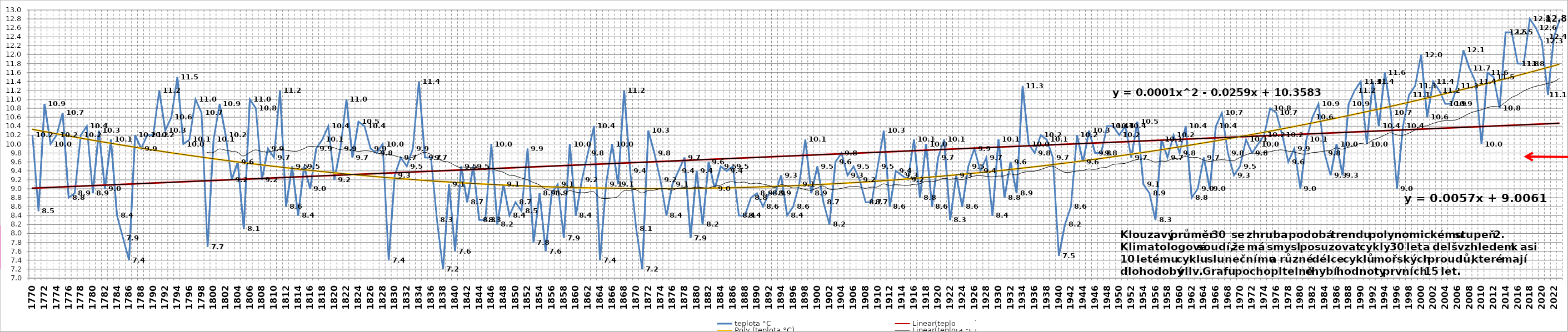
| Category | teplota °C |
|---|---|
| 1770 | 10.2 |
| 1771 | 8.5 |
| 1772 | 10.9 |
| 1773 | 10 |
| 1774 | 10.2 |
| 1775 | 10.7 |
| 1776 | 8.8 |
| 1777 | 8.9 |
| 1778 | 10.2 |
| 1779 | 10.4 |
| 1780 | 8.9 |
| 1781 | 10.3 |
| 1782 | 9 |
| 1783 | 10.1 |
| 1784 | 8.4 |
| 1785 | 7.9 |
| 1786 | 7.4 |
| 1787 | 10.2 |
| 1788 | 9.9 |
| 1789 | 10.2 |
| 1790 | 10.2 |
| 1791 | 11.2 |
| 1792 | 10.3 |
| 1793 | 10.6 |
| 1794 | 11.5 |
| 1795 | 10 |
| 1796 | 10.1 |
| 1797 | 11 |
| 1798 | 10.7 |
| 1799 | 7.7 |
| 1800 | 10.1 |
| 1801 | 10.9 |
| 1802 | 10.2 |
| 1803 | 9.2 |
| 1804 | 9.6 |
| 1805 | 8.1 |
| 1806 | 11 |
| 1807 | 10.8 |
| 1808 | 9.2 |
| 1809 | 9.9 |
| 1810 | 9.7 |
| 1811 | 11.2 |
| 1812 | 8.6 |
| 1813 | 9.5 |
| 1814 | 8.4 |
| 1815 | 9.5 |
| 1816 | 9 |
| 1817 | 9.9 |
| 1818 | 10.1 |
| 1819 | 10.4 |
| 1820 | 9.2 |
| 1821 | 9.9 |
| 1822 | 11 |
| 1823 | 9.7 |
| 1824 | 10.5 |
| 1825 | 10.4 |
| 1826 | 9.9 |
| 1827 | 9.8 |
| 1828 | 10 |
| 1829 | 7.4 |
| 1830 | 9.3 |
| 1831 | 9.7 |
| 1832 | 9.5 |
| 1833 | 9.9 |
| 1834 | 11.4 |
| 1835 | 9.7 |
| 1836 | 9.7 |
| 1837 | 8.3 |
| 1838 | 7.2 |
| 1839 | 9.1 |
| 1840 | 7.6 |
| 1841 | 9.5 |
| 1842 | 8.7 |
| 1843 | 9.5 |
| 1844 | 8.3 |
| 1845 | 8.3 |
| 1846 | 10 |
| 1847 | 8.2 |
| 1848 | 9.1 |
| 1849 | 8.4 |
| 1850 | 8.7 |
| 1851 | 8.5 |
| 1852 | 9.9 |
| 1853 | 7.8 |
| 1854 | 8.9 |
| 1855 | 7.6 |
| 1856 | 8.9 |
| 1857 | 9.1 |
| 1858 | 7.9 |
| 1859 | 10 |
| 1860 | 8.4 |
| 1861 | 9.2 |
| 1862 | 9.8 |
| 1863 | 10.4 |
| 1864 | 7.4 |
| 1865 | 9.1 |
| 1866 | 10 |
| 1867 | 9.1 |
| 1868 | 11.2 |
| 1869 | 9.4 |
| 1870 | 8.1 |
| 1871 | 7.2 |
| 1872 | 10.3 |
| 1873 | 9.8 |
| 1874 | 9.2 |
| 1875 | 8.4 |
| 1876 | 9.1 |
| 1877 | 9.4 |
| 1878 | 9.7 |
| 1879 | 7.9 |
| 1880 | 9.4 |
| 1881 | 8.2 |
| 1882 | 9.6 |
| 1883 | 9 |
| 1884 | 9.5 |
| 1885 | 9.4 |
| 1886 | 9.5 |
| 1887 | 8.4 |
| 1888 | 8.4 |
| 1889 | 8.8 |
| 1890 | 8.9 |
| 1891 | 8.6 |
| 1892 | 8.9 |
| 1893 | 8.9 |
| 1894 | 9.3 |
| 1895 | 8.4 |
| 1896 | 8.6 |
| 1897 | 9.1 |
| 1898 | 10.1 |
| 1899 | 8.9 |
| 1900 | 9.5 |
| 1901 | 8.7 |
| 1902 | 8.2 |
| 1903 | 9.6 |
| 1904 | 9.8 |
| 1905 | 9.3 |
| 1906 | 9.5 |
| 1907 | 9.2 |
| 1908 | 8.7 |
| 1909 | 8.7 |
| 1910 | 9.5 |
| 1911 | 10.3 |
| 1912 | 8.6 |
| 1913 | 9.4 |
| 1914 | 9.3 |
| 1915 | 9.2 |
| 1916 | 10.1 |
| 1917 | 8.8 |
| 1918 | 10 |
| 1919 | 8.6 |
| 1920 | 9.7 |
| 1921 | 10.1 |
| 1922 | 8.3 |
| 1923 | 9.3 |
| 1924 | 8.6 |
| 1925 | 9.5 |
| 1926 | 9.9 |
| 1927 | 9.4 |
| 1928 | 9.7 |
| 1929 | 8.4 |
| 1930 | 10.1 |
| 1931 | 8.8 |
| 1932 | 9.6 |
| 1933 | 8.9 |
| 1934 | 11.3 |
| 1935 | 10 |
| 1936 | 9.8 |
| 1937 | 10.2 |
| 1938 | 10.1 |
| 1939 | 9.7 |
| 1940 | 7.5 |
| 1941 | 8.2 |
| 1942 | 8.6 |
| 1943 | 10.2 |
| 1944 | 9.6 |
| 1945 | 10.3 |
| 1946 | 9.8 |
| 1947 | 9.8 |
| 1948 | 10.4 |
| 1949 | 10.4 |
| 1950 | 10.2 |
| 1951 | 10.4 |
| 1952 | 9.7 |
| 1953 | 10.5 |
| 1954 | 9.1 |
| 1955 | 8.9 |
| 1956 | 8.3 |
| 1957 | 10.1 |
| 1958 | 9.7 |
| 1959 | 10.2 |
| 1960 | 9.8 |
| 1961 | 10.4 |
| 1962 | 8.8 |
| 1963 | 9 |
| 1964 | 9.7 |
| 1965 | 9 |
| 1966 | 10.4 |
| 1967 | 10.7 |
| 1968 | 9.8 |
| 1969 | 9.3 |
| 1970 | 9.5 |
| 1971 | 10.1 |
| 1972 | 9.8 |
| 1973 | 10 |
| 1974 | 10.2 |
| 1975 | 10.8 |
| 1976 | 10.7 |
| 1977 | 10.2 |
| 1978 | 9.6 |
| 1979 | 9.9 |
| 1980 | 9 |
| 1981 | 10.1 |
| 1982 | 10.6 |
| 1983 | 10.9 |
| 1984 | 9.8 |
| 1985 | 9.3 |
| 1986 | 10 |
| 1987 | 9.3 |
| 1988 | 10.9 |
| 1989 | 11.2 |
| 1990 | 11.4 |
| 1991 | 10 |
| 1992 | 11.4 |
| 1993 | 10.4 |
| 1994 | 11.6 |
| 1995 | 10.7 |
| 1996 | 9 |
| 1997 | 10.4 |
| 1998 | 11.1 |
| 1999 | 11.3 |
| 2000 | 12 |
| 2001 | 10.6 |
| 2002 | 11.4 |
| 2003 | 11.2 |
| 2004 | 10.9 |
| 2005 | 10.9 |
| 2006 | 11.3 |
| 2007 | 12.1 |
| 2008 | 11.7 |
| 2009 | 11.4 |
| 2010 | 10 |
| 2011 | 11.6 |
| 2012 | 11.5 |
| 2013 | 10.8 |
| 2014 | 12.5 |
| 2015 | 12.5 |
| 2016 | 11.8 |
| 2017 | 11.8 |
| 2018 | 12.8 |
| 2019 | 12.6 |
| 2020 | 12.3 |
| 2021 | 11.1 |
| 2022 | 12.4 |
| 2023 | 12.8 |